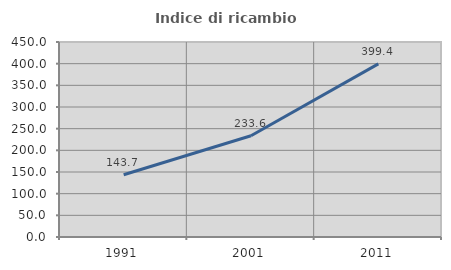
| Category | Indice di ricambio occupazionale  |
|---|---|
| 1991.0 | 143.733 |
| 2001.0 | 233.641 |
| 2011.0 | 399.429 |